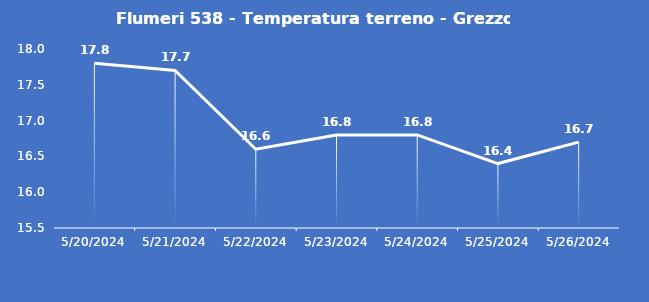
| Category | Flumeri 538 - Temperatura terreno - Grezzo (°C) |
|---|---|
| 5/20/24 | 17.8 |
| 5/21/24 | 17.7 |
| 5/22/24 | 16.6 |
| 5/23/24 | 16.8 |
| 5/24/24 | 16.8 |
| 5/25/24 | 16.4 |
| 5/26/24 | 16.7 |